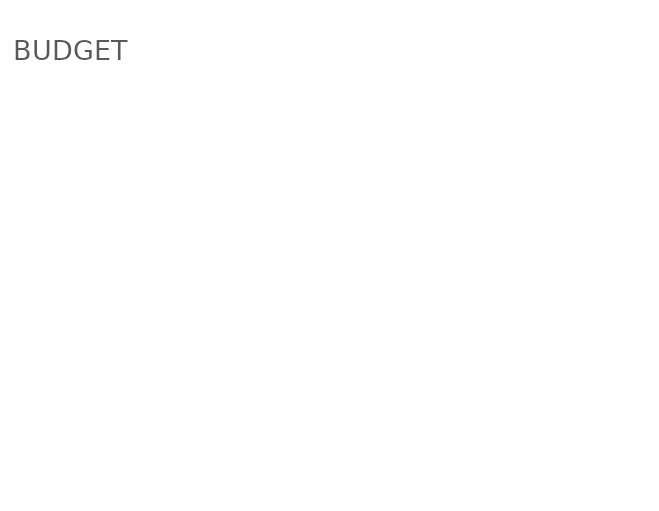
| Category | BUDGET |
|---|---|
| OCCUPAZIONE - TEMPO INDETERMINATO | 0 |
| OCCUPAZIONE - OCCASIONALE | 0 |
| GENERALE/AMMINISTRAZIONE | 0 |
| OPERAZIONI | 0 |
| MARKETING/PROMOZIONI | 0 |
| SITO WEB/APP MOBILE | 0 |
| OCCUPAZIONE | 0 |
| AUTOMOTIVE | 0 |
| ALTRI | 0 |